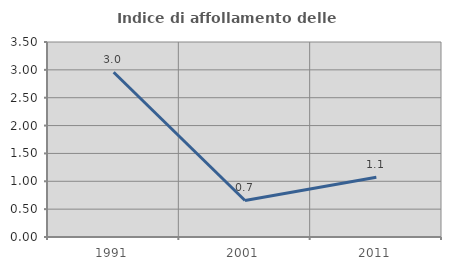
| Category | Indice di affollamento delle abitazioni  |
|---|---|
| 1991.0 | 2.957 |
| 2001.0 | 0.655 |
| 2011.0 | 1.072 |